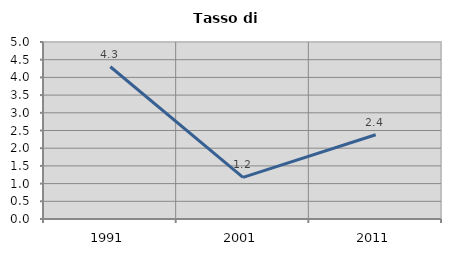
| Category | Tasso di disoccupazione   |
|---|---|
| 1991.0 | 4.301 |
| 2001.0 | 1.176 |
| 2011.0 | 2.381 |